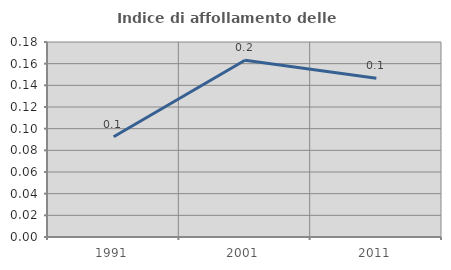
| Category | Indice di affollamento delle abitazioni  |
|---|---|
| 1991.0 | 0.093 |
| 2001.0 | 0.163 |
| 2011.0 | 0.147 |